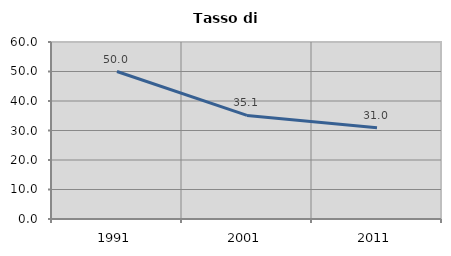
| Category | Tasso di disoccupazione   |
|---|---|
| 1991.0 | 50 |
| 2001.0 | 35.104 |
| 2011.0 | 30.958 |